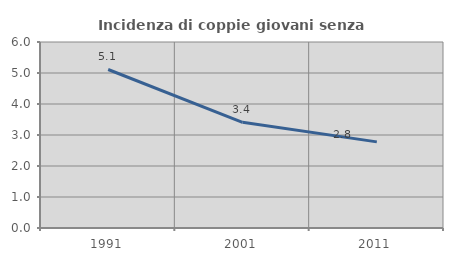
| Category | Incidenza di coppie giovani senza figli |
|---|---|
| 1991.0 | 5.113 |
| 2001.0 | 3.41 |
| 2011.0 | 2.778 |